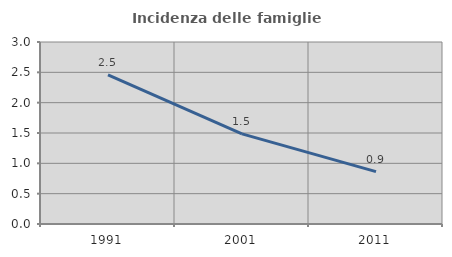
| Category | Incidenza delle famiglie numerose |
|---|---|
| 1991.0 | 2.456 |
| 2001.0 | 1.486 |
| 2011.0 | 0.864 |